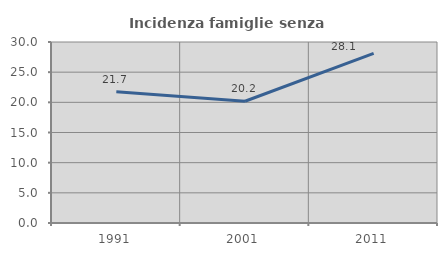
| Category | Incidenza famiglie senza nuclei |
|---|---|
| 1991.0 | 21.739 |
| 2001.0 | 20.183 |
| 2011.0 | 28.125 |